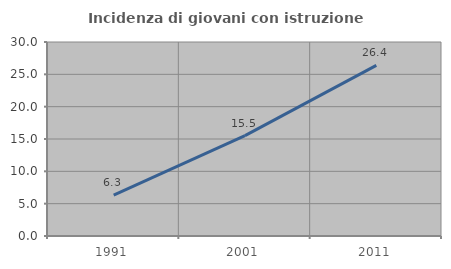
| Category | Incidenza di giovani con istruzione universitaria |
|---|---|
| 1991.0 | 6.316 |
| 2001.0 | 15.517 |
| 2011.0 | 26.389 |